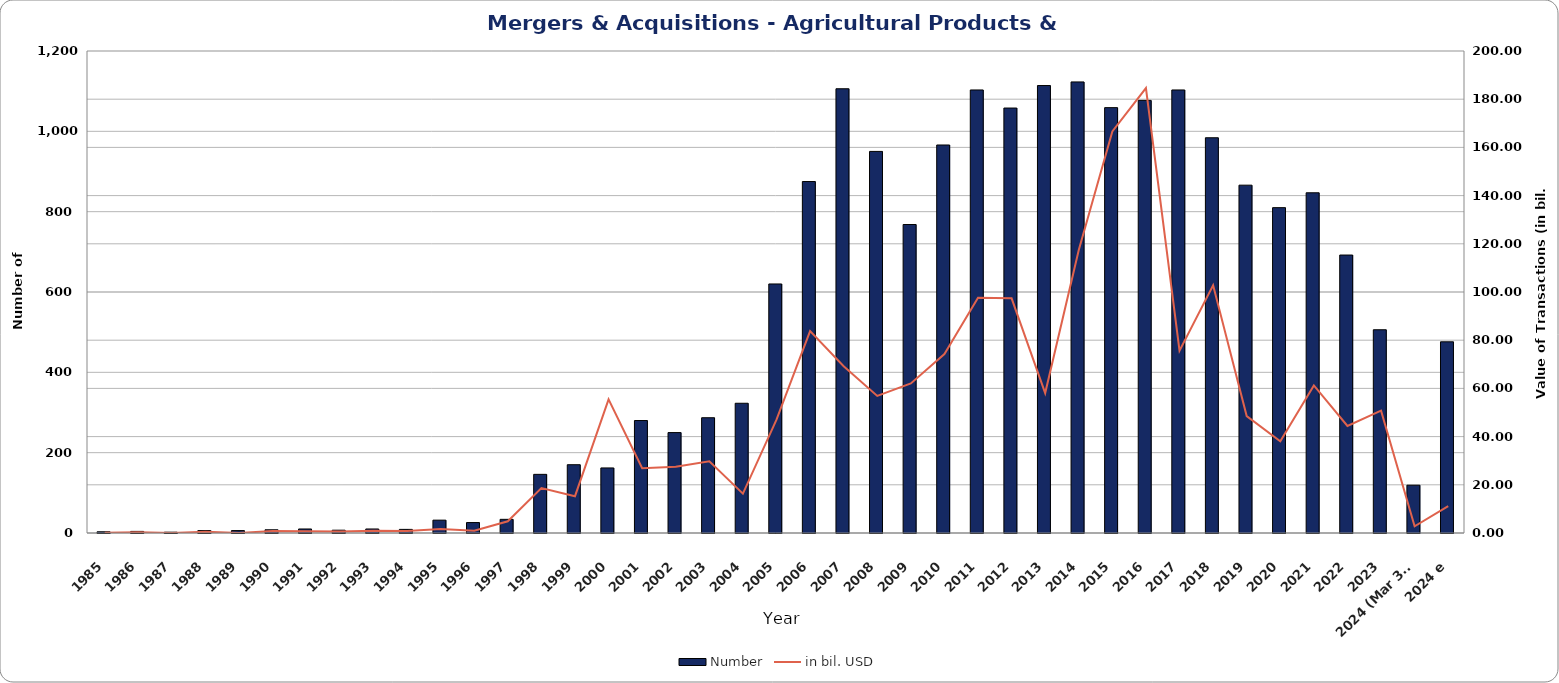
| Category | Number |
|---|---|
| 1985 | 3 |
| 1986 | 4 |
| 1987 | 2 |
| 1988 | 6 |
| 1989 | 6 |
| 1990 | 8 |
| 1991 | 10 |
| 1992 | 7 |
| 1993 | 10 |
| 1994 | 9 |
| 1995 | 32 |
| 1996 | 26 |
| 1997 | 34 |
| 1998 | 146 |
| 1999 | 170 |
| 2000 | 162 |
| 2001 | 280 |
| 2002 | 250 |
| 2003 | 287 |
| 2004 | 323 |
| 2005 | 620 |
| 2006 | 875 |
| 2007 | 1106 |
| 2008 | 950 |
| 2009 | 768 |
| 2010 | 966 |
| 2011 | 1103 |
| 2012 | 1058 |
| 2013 | 1114 |
| 2014 | 1123 |
| 2015 | 1059 |
| 2016 | 1077 |
| 2017 | 1103 |
| 2018 | 984 |
| 2019 | 866 |
| 2020 | 810 |
| 2021 | 847 |
| 2022 | 692 |
| 2023 | 506 |
| 2024 (Mar 31) | 119 |
| 2024 e | 476 |